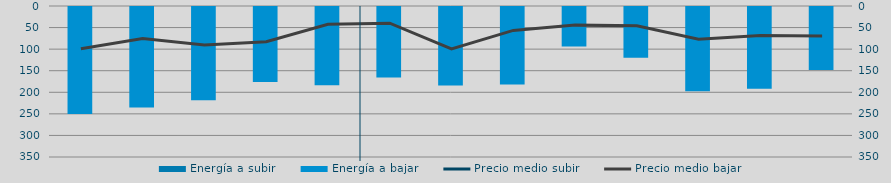
| Category | Energía a subir | Energía a bajar |
|---|---|---|
| A |  | 250.14 |
| S |  | 234.984 |
| O |  | 218.689 |
| N |  | 176.116 |
| D |  | 183.605 |
| E |  | 165.84 |
| F |  | 184.155 |
| M |  | 182.05 |
| A |  | 93.896 |
| M |  | 120.063 |
| J |  | 197.687 |
| J |  | 191.747 |
| A |  | 148.51 |